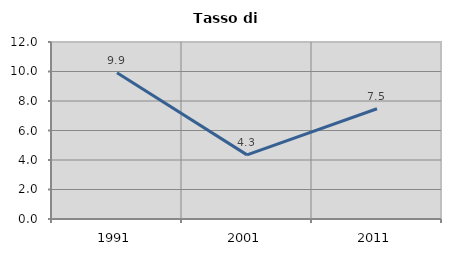
| Category | Tasso di disoccupazione   |
|---|---|
| 1991.0 | 9.917 |
| 2001.0 | 4.348 |
| 2011.0 | 7.477 |